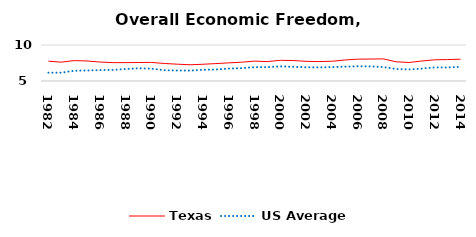
| Category | Texas | US Average |
|---|---|---|
| 1982.0 | 7.754 | 6.149 |
| 1983.0 | 7.617 | 6.152 |
| 1984.0 | 7.834 | 6.429 |
| 1985.0 | 7.783 | 6.464 |
| 1986.0 | 7.631 | 6.512 |
| 1987.0 | 7.549 | 6.552 |
| 1988.0 | 7.553 | 6.659 |
| 1989.0 | 7.566 | 6.767 |
| 1990.0 | 7.579 | 6.71 |
| 1991.0 | 7.43 | 6.502 |
| 1992.0 | 7.338 | 6.463 |
| 1993.0 | 7.253 | 6.446 |
| 1994.0 | 7.324 | 6.563 |
| 1995.0 | 7.418 | 6.593 |
| 1996.0 | 7.519 | 6.73 |
| 1997.0 | 7.609 | 6.781 |
| 1998.0 | 7.763 | 6.926 |
| 1999.0 | 7.697 | 6.925 |
| 2000.0 | 7.871 | 7.031 |
| 2001.0 | 7.844 | 6.969 |
| 2002.0 | 7.731 | 6.912 |
| 2003.0 | 7.696 | 6.892 |
| 2004.0 | 7.74 | 6.934 |
| 2005.0 | 7.913 | 6.99 |
| 2006.0 | 8.033 | 7.048 |
| 2007.0 | 8.051 | 7.028 |
| 2008.0 | 8.071 | 6.935 |
| 2009.0 | 7.663 | 6.668 |
| 2010.0 | 7.569 | 6.605 |
| 2011.0 | 7.781 | 6.72 |
| 2012.0 | 7.943 | 6.883 |
| 2013.0 | 7.976 | 6.881 |
| 2014.0 | 8.029 | 6.973 |